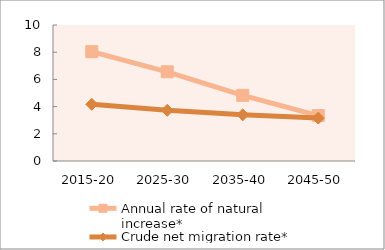
| Category | Annual rate of natural increase* | Crude net migration rate* |
|---|---|---|
| 2015-20 | 8.04 | 4.17 |
| 2025-30 | 6.56 | 3.726 |
| 2035-40 | 4.827 | 3.397 |
| 2045-50 | 3.341 | 3.157 |